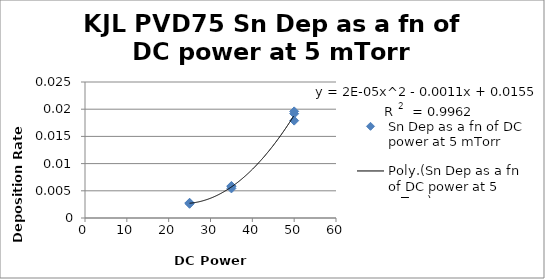
| Category | Sn Dep as a fn of DC power at 5 mTorr |
|---|---|
| 50.0 | 0.019 |
| 50.0 | 0.018 |
| 50.0 | 0.02 |
| 35.0 | 0.006 |
| 35.0 | 0.005 |
| 35.0 | 0.006 |
| 25.0 | 0.003 |
| 25.0 | 0.003 |
| 25.0 | 0.003 |